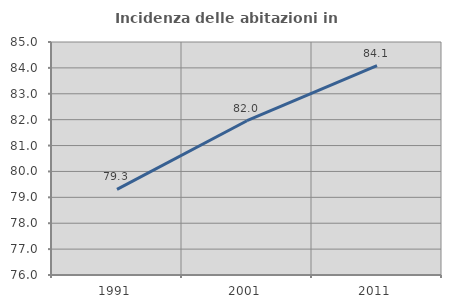
| Category | Incidenza delle abitazioni in proprietà  |
|---|---|
| 1991.0 | 79.305 |
| 2001.0 | 81.959 |
| 2011.0 | 84.083 |